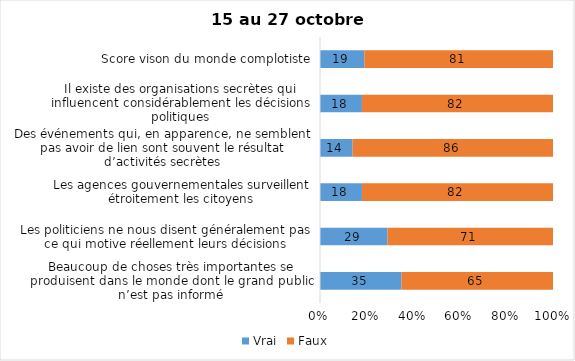
| Category | Vrai | Faux |
|---|---|---|
| Beaucoup de choses très importantes se produisent dans le monde dont le grand public n’est pas informé | 35 | 65 |
| Les politiciens ne nous disent généralement pas ce qui motive réellement leurs décisions | 29 | 71 |
| Les agences gouvernementales surveillent étroitement les citoyens | 18 | 82 |
| Des événements qui, en apparence, ne semblent pas avoir de lien sont souvent le résultat d’activités secrètes | 14 | 86 |
| Il existe des organisations secrètes qui influencent considérablement les décisions politiques | 18 | 82 |
| Score vison du monde complotiste | 19 | 81 |